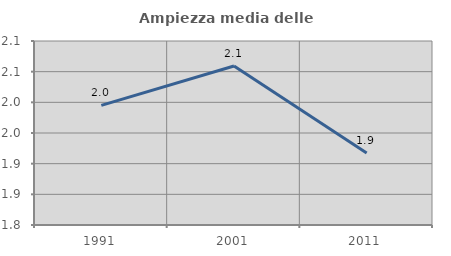
| Category | Ampiezza media delle famiglie |
|---|---|
| 1991.0 | 1.995 |
| 2001.0 | 2.059 |
| 2011.0 | 1.918 |